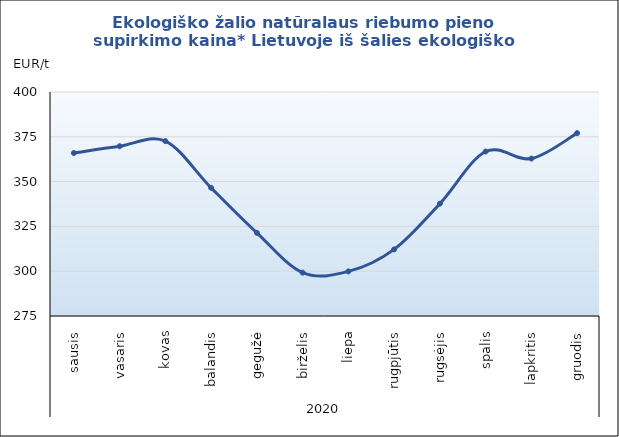
| Category | Ekologiško žalio natūralaus riebumo pieno supirkimo kaina* Lietuvoje iš šalies ekologiško pieno gamintojų |
|---|---|
| 0 | 365.94 |
| 1 | 369.72 |
| 2 | 372.59 |
| 3 | 346.5 |
| 4 | 321.41 |
| 5 | 299.2 |
| 6 | 299.88 |
| 7 | 312.18 |
| 8 | 337.69 |
| 9 | 366.79 |
| 10 | 362.84 |
| 11 | 377.04 |